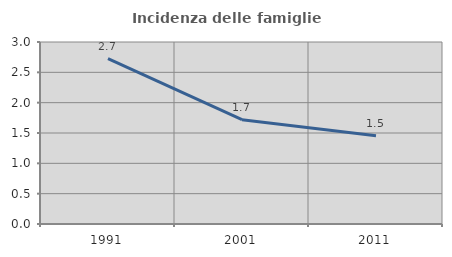
| Category | Incidenza delle famiglie numerose |
|---|---|
| 1991.0 | 2.727 |
| 2001.0 | 1.719 |
| 2011.0 | 1.454 |